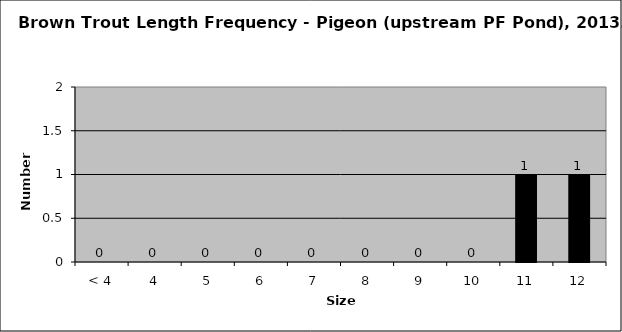
| Category | Series 0 |
|---|---|
| < 4 | 0 |
| 4 | 0 |
| 5 | 0 |
| 6 | 0 |
| 7 | 0 |
| 8 | 0 |
| 9 | 0 |
| 10 | 0 |
| 11 | 1 |
| 12 | 1 |